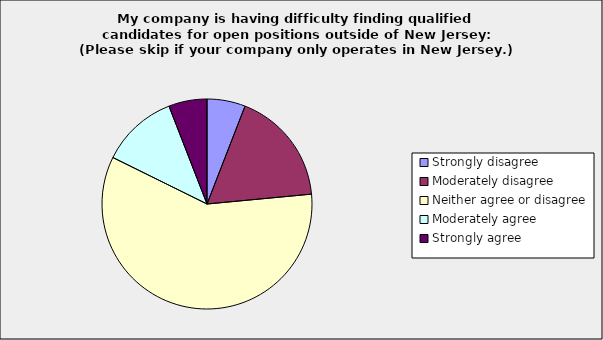
| Category | Series 0 |
|---|---|
| Strongly disagree | 0.059 |
| Moderately disagree | 0.176 |
| Neither agree or disagree | 0.588 |
| Moderately agree | 0.118 |
| Strongly agree | 0.059 |